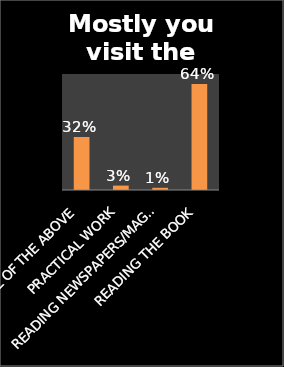
| Category | Series 0 |
|---|---|
| ALL OF THE ABOVE | 0.32 |
| PRACTICAL WORK | 0.027 |
| READING NEWSPAPERS/MAGAZINE | 0.013 |
| READING THE BOOK | 0.64 |